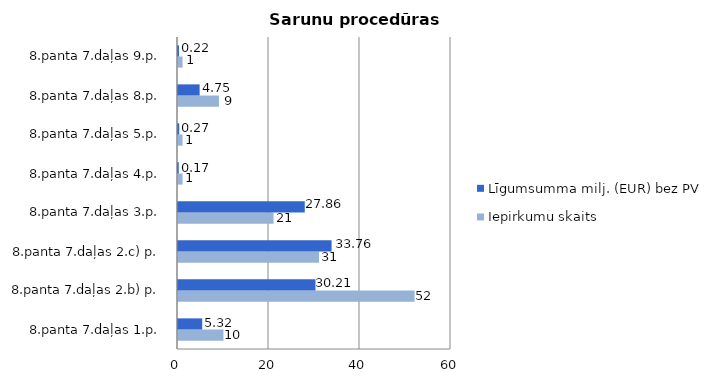
| Category | Iepirkumu skaits | Līgumsumma milj. (EUR) bez PVN |
|---|---|---|
| 8.panta 7.daļas 1.p. | 10 | 5.321 |
| 8.panta 7.daļas 2.b) p. | 52 | 30.209 |
| 8.panta 7.daļas 2.c) p. | 31 | 33.758 |
| 8.panta 7.daļas 3.p. | 21 | 27.859 |
| 8.panta 7.daļas 4.p. | 1 | 0.172 |
| 8.panta 7.daļas 5.p. | 1 | 0.27 |
| 8.panta 7.daļas 8.p. | 9 | 4.755 |
| 8.panta 7.daļas 9.p. | 1 | 0.223 |